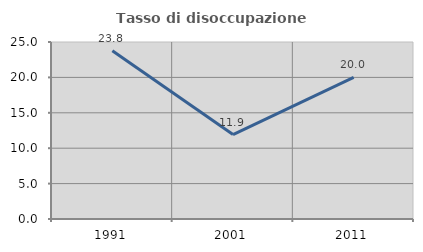
| Category | Tasso di disoccupazione giovanile  |
|---|---|
| 1991.0 | 23.767 |
| 2001.0 | 11.921 |
| 2011.0 | 20 |